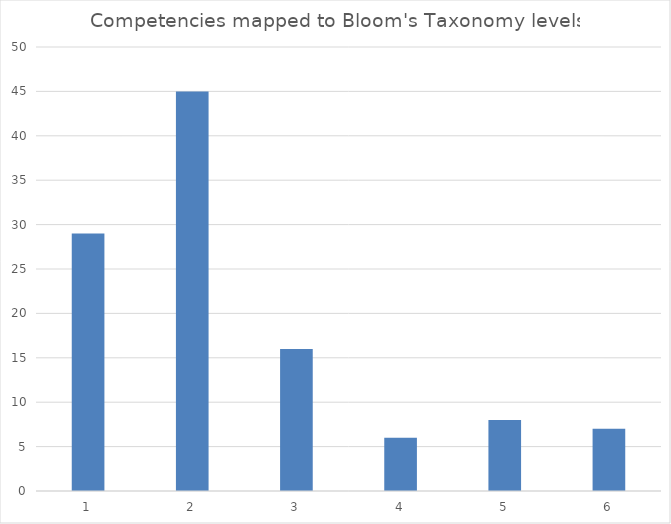
| Category | Series 0 |
|---|---|
| 0 | 29 |
| 1 | 45 |
| 2 | 16 |
| 3 | 6 |
| 4 | 8 |
| 5 | 7 |